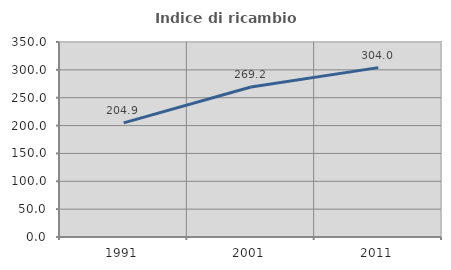
| Category | Indice di ricambio occupazionale  |
|---|---|
| 1991.0 | 204.918 |
| 2001.0 | 269.231 |
| 2011.0 | 304 |